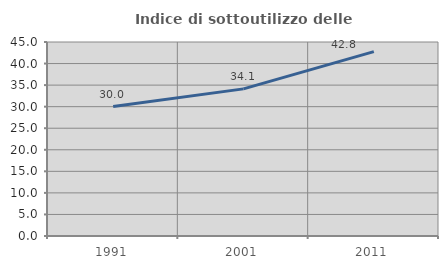
| Category | Indice di sottoutilizzo delle abitazioni  |
|---|---|
| 1991.0 | 30.029 |
| 2001.0 | 34.128 |
| 2011.0 | 42.756 |